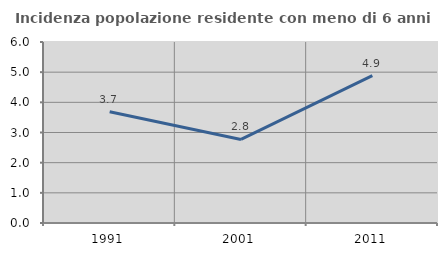
| Category | Incidenza popolazione residente con meno di 6 anni |
|---|---|
| 1991.0 | 3.687 |
| 2001.0 | 2.769 |
| 2011.0 | 4.884 |